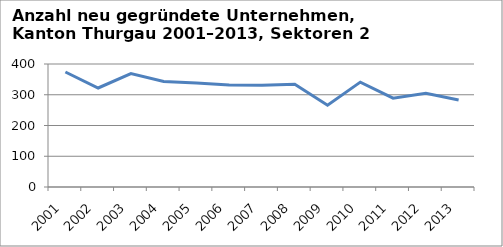
| Category | Sektoren 2 und 3 |
|---|---|
| 2001.0 | 374 |
| 2002.0 | 322 |
| 2003.0 | 369 |
| 2004.0 | 343 |
| 2005.0 | 338 |
| 2006.0 | 332 |
| 2007.0 | 331 |
| 2008.0 | 334 |
| 2009.0 | 266 |
| 2010.0 | 341 |
| 2011.0 | 289 |
| 2012.0 | 305 |
| 2013.0 | 283 |